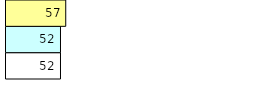
| Category | Total Standouts | Total Recd | Total Tipsters |
|---|---|---|---|
| 0 | 52 | 52 | 57 |